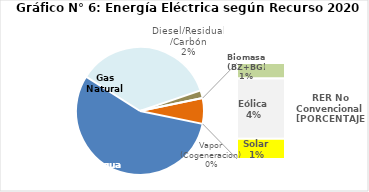
| Category | Series 0 |
|---|---|
| Agua | 2243.908 |
| Gas Natural | 1437.599 |
| Diesel/Residual/Carbón | 80.224 |
| Vapor (Cogeneracion) | 0.175 |
| Biomasa (BZ+BG) | 42.205 |
| Eólica | 162.692 |
| Solar | 55.072 |